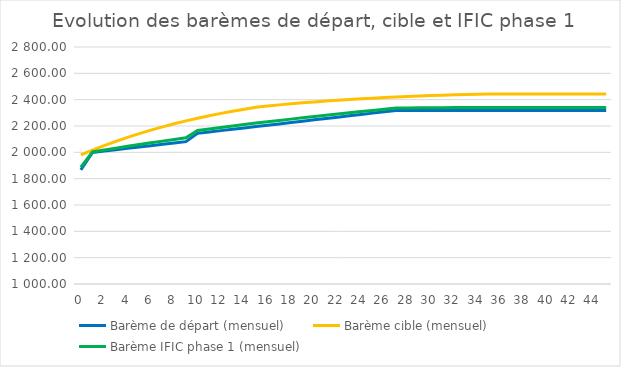
| Category | Barème de départ (mensuel) | Barème cible | Barème cible (mensuel) | Delta | Barème IFIC phase 1 (mensuel) |
|---|---|---|---|---|---|
| 0.0 | 1866.32 |  | 1980.7 |  | 1887.19 |
| 1.0 | 1999.55 |  | 2017.04 |  | 2002.74 |
| 2.0 | 2009.78 |  | 2051.27 |  | 2017.35 |
| 3.0 | 2020.01 |  | 2083.47 |  | 2031.59 |
| 4.0 | 2030.24 |  | 2113.73 |  | 2045.48 |
| 5.0 | 2040.47 |  | 2142.12 |  | 2059.02 |
| 6.0 | 2050.69 |  | 2168.73 |  | 2072.23 |
| 7.0 | 2060.92 |  | 2193.65 |  | 2085.14 |
| 8.0 | 2071.15 |  | 2216.97 |  | 2097.76 |
| 9.0 | 2081.38 |  | 2238.76 |  | 2110.1 |
| 10.0 | 2144.36 |  | 2259.12 |  | 2165.3 |
| 11.0 | 2154.59 |  | 2278.13 |  | 2177.14 |
| 12.0 | 2164.82 |  | 2295.85 |  | 2188.73 |
| 13.0 | 2175.05 |  | 2312.37 |  | 2200.11 |
| 14.0 | 2185.28 |  | 2327.77 |  | 2211.28 |
| 15.0 | 2195.51 |  | 2342.11 |  | 2222.26 |
| 16.0 | 2205.73 |  | 2351.58 |  | 2232.35 |
| 17.0 | 2215.96 |  | 2360.39 |  | 2242.32 |
| 18.0 | 2226.19 |  | 2368.55 |  | 2252.17 |
| 19.0 | 2236.42 |  | 2376.14 |  | 2261.92 |
| 20.0 | 2246.65 |  | 2383.18 |  | 2271.57 |
| 21.0 | 2256.88 |  | 2389.71 |  | 2281.12 |
| 22.0 | 2267.11 |  | 2395.76 |  | 2290.59 |
| 23.0 | 2277.34 |  | 2401.38 |  | 2299.98 |
| 24.0 | 2287.57 |  | 2406.59 |  | 2309.29 |
| 25.0 | 2297.8 |  | 2411.42 |  | 2318.54 |
| 26.0 | 2308.03 |  | 2415.89 |  | 2327.71 |
| 27.0 | 2318.25 |  | 2420.03 |  | 2336.82 |
| 28.0 | 2318.25 |  | 2423.88 |  | 2337.53 |
| 29.0 | 2318.25 |  | 2427.44 |  | 2338.18 |
| 30.0 | 2318.25 |  | 2430.74 |  | 2338.78 |
| 31.0 | 2318.25 |  | 2433.79 |  | 2339.34 |
| 32.0 | 2318.25 |  | 2436.62 |  | 2339.85 |
| 33.0 | 2318.25 |  | 2439.24 |  | 2340.33 |
| 34.0 | 2318.25 |  | 2441.66 |  | 2340.77 |
| 35.0 | 2318.25 |  | 2443.91 |  | 2341.18 |
| 36.0 | 2318.25 |  | 2443.91 |  | 2341.18 |
| 37.0 | 2318.25 |  | 2443.91 |  | 2341.18 |
| 38.0 | 2318.25 |  | 2443.91 |  | 2341.18 |
| 39.0 | 2318.25 |  | 2443.91 |  | 2341.18 |
| 40.0 | 2318.25 |  | 2443.91 |  | 2341.18 |
| 41.0 | 2318.25 |  | 2443.91 |  | 2341.18 |
| 42.0 | 2318.25 |  | 2443.91 |  | 2341.18 |
| 43.0 | 2318.25 |  | 2443.91 |  | 2341.18 |
| 44.0 | 2318.25 |  | 2443.91 |  | 2341.18 |
| 45.0 | 2318.25 |  | 2443.91 |  | 2341.18 |